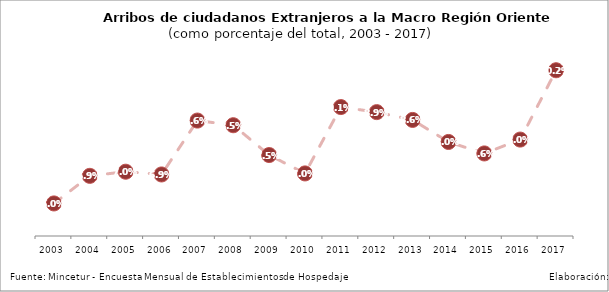
| Category | Series 1 |
|---|---|
| 2003.0 | 0.06 |
| 2004.0 | 0.069 |
| 2005.0 | 0.07 |
| 2006.0 | 0.069 |
| 2007.0 | 0.086 |
| 2008.0 | 0.085 |
| 2009.0 | 0.075 |
| 2010.0 | 0.07 |
| 2011.0 | 0.091 |
| 2012.0 | 0.089 |
| 2013.0 | 0.086 |
| 2014.0 | 0.08 |
| 2015.0 | 0.076 |
| 2016.0 | 0.08 |
| 2017.0 | 0.102 |